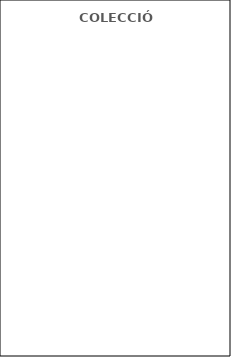
| Category | Series 0 |
|---|---|
| Albúm | 0 |
| Cuento | 0 |
| Poesía | 0 |
| Historieta | 0 |
| Teatro | 0 |
| Novela | 0 |
| Leyenda y mitologia | 0 |